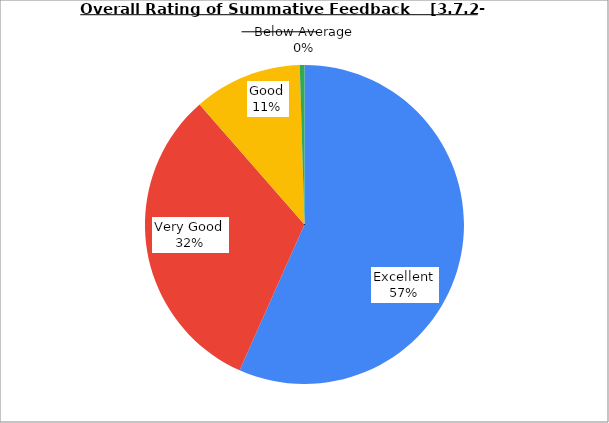
| Category | Series 0 |
|---|---|
| Excellent | 56.667 |
| Very Good | 31.905 |
| Good | 10.952 |
| Average | 0.476 |
| Below Average | 0 |